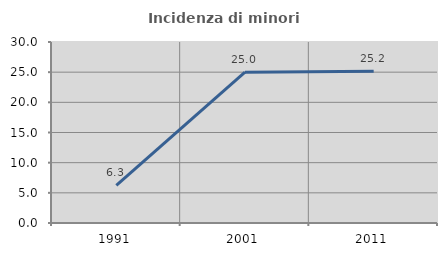
| Category | Incidenza di minori stranieri |
|---|---|
| 1991.0 | 6.25 |
| 2001.0 | 25 |
| 2011.0 | 25.166 |